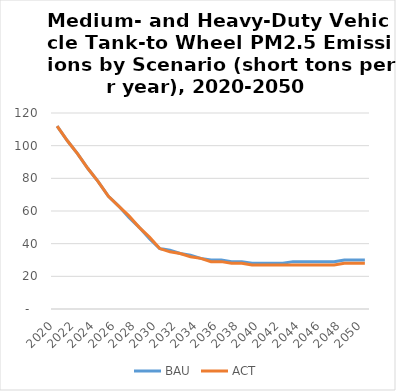
| Category | BAU | ACT |
|---|---|---|
| 2020.0 | 112 | 112 |
| 2021.0 | 103 | 103 |
| 2022.0 | 95 | 95 |
| 2023.0 | 86 | 86 |
| 2024.0 | 78 | 78 |
| 2025.0 | 69 | 69 |
| 2026.0 | 63 | 63 |
| 2027.0 | 56 | 57 |
| 2028.0 | 50 | 50 |
| 2029.0 | 43 | 44 |
| 2030.0 | 37 | 37 |
| 2031.0 | 36 | 35 |
| 2032.0 | 34 | 34 |
| 2033.0 | 33 | 32 |
| 2034.0 | 31 | 31 |
| 2035.0 | 30 | 29 |
| 2036.0 | 30 | 29 |
| 2037.0 | 29 | 28 |
| 2038.0 | 29 | 28 |
| 2039.0 | 28 | 27 |
| 2040.0 | 28 | 27 |
| 2041.0 | 28 | 27 |
| 2042.0 | 28 | 27 |
| 2043.0 | 29 | 27 |
| 2044.0 | 29 | 27 |
| 2045.0 | 29 | 27 |
| 2046.0 | 29 | 27 |
| 2047.0 | 29 | 27 |
| 2048.0 | 30 | 28 |
| 2049.0 | 30 | 28 |
| 2050.0 | 30 | 28 |